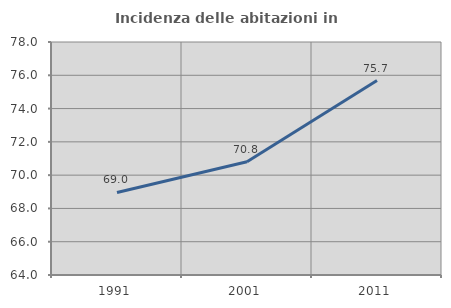
| Category | Incidenza delle abitazioni in proprietà  |
|---|---|
| 1991.0 | 68.961 |
| 2001.0 | 70.805 |
| 2011.0 | 75.681 |